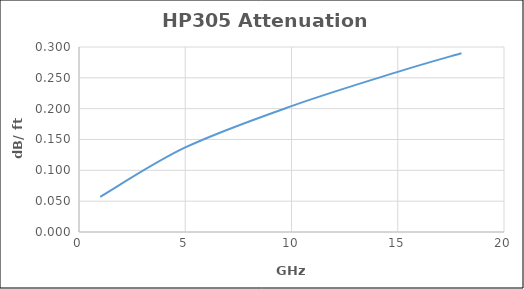
| Category | dB |
|---|---|
| 1.0 | 0.057 |
| 5.0 | 0.137 |
| 10.0 | 0.204 |
| 15.0 | 0.26 |
| 18.0 | 0.29 |